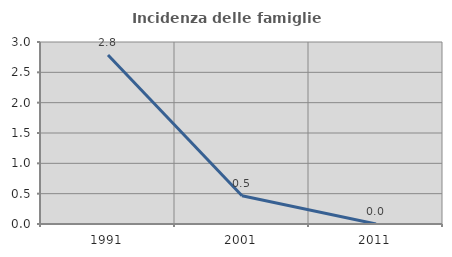
| Category | Incidenza delle famiglie numerose |
|---|---|
| 1991.0 | 2.786 |
| 2001.0 | 0.466 |
| 2011.0 | 0 |